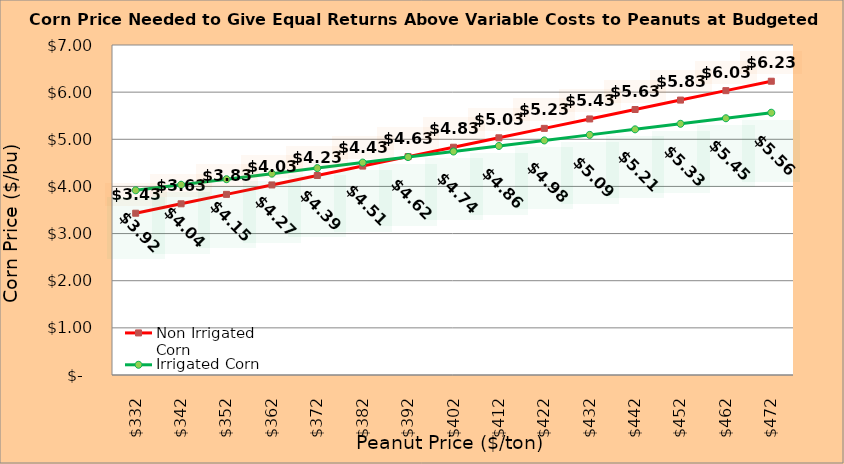
| Category | Non Irrigated Corn | Irrigated Corn |
|---|---|---|
| 332.02127659574467 | 3.432 | 3.919 |
| 342.02127659574467 | 3.632 | 4.036 |
| 352.02127659574467 | 3.832 | 4.154 |
| 362.02127659574467 | 4.032 | 4.271 |
| 372.02127659574467 | 4.232 | 4.389 |
| 382.02127659574467 | 4.432 | 4.506 |
| 392.02127659574467 | 4.632 | 4.624 |
| 402.02127659574467 | 4.832 | 4.741 |
| 412.02127659574467 | 5.032 | 4.859 |
| 422.02127659574467 | 5.232 | 4.976 |
| 432.02127659574467 | 5.432 | 5.094 |
| 442.02127659574467 | 5.632 | 5.211 |
| 452.02127659574467 | 5.832 | 5.329 |
| 462.02127659574467 | 6.032 | 5.446 |
| 472.02127659574467 | 6.232 | 5.564 |